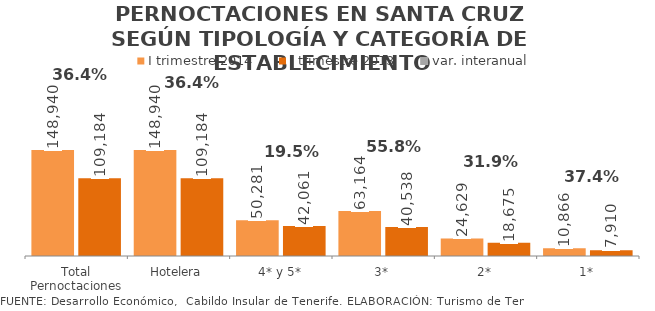
| Category | I trimestre 2014 | I trimestre 2013 |
|---|---|---|
| Total Pernoctaciones | 148940 | 109184 |
| Hotelera | 148940 | 109184 |
| 4* y 5* | 50281 | 42061 |
| 3* | 63164 | 40538 |
| 2* | 24629 | 18675 |
| 1* | 10866 | 7910 |